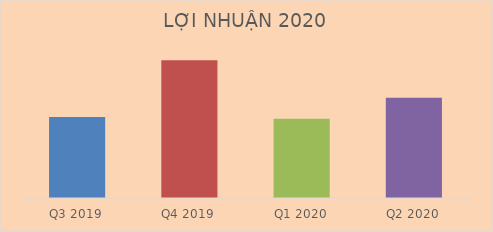
| Category | Doanh thu thuần |
|---|---|
| Q3 2019 | 1066700970808 |
| Q4 2019 | 1812281240434 |
| Q1 2020 | 1042844745900 |
| Q2 2020 | 1318291713653 |